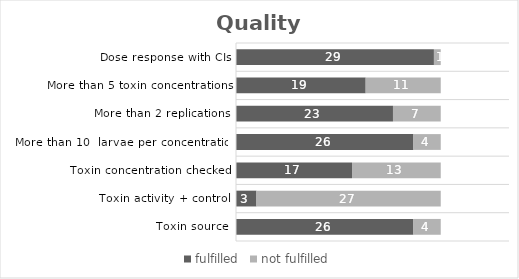
| Category | fulfilled | not fulfilled |
|---|---|---|
| Toxin source | 26 | 4 |
| Toxin activity + control | 3 | 27 |
| Toxin concentration checked | 17 | 13 |
|  More than 10  larvae per concentration | 26 | 4 |
| More than 2 replications | 23 | 7 |
|  More than 5 toxin concentrations | 19 | 11 |
| Dose response with CIs | 29 | 1 |